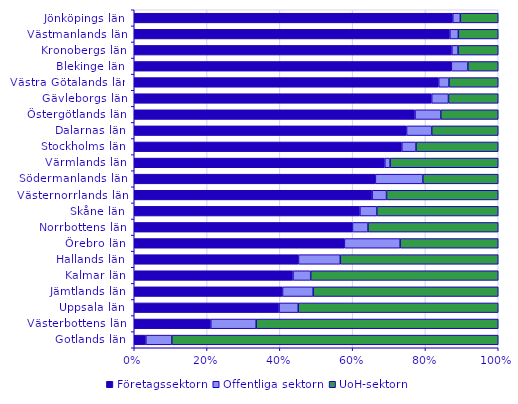
| Category | Företagssektorn | Offentliga sektorn | UoH-sektorn |
|---|---|---|---|
| Jönköpings län | 2723 | 65 | 324 |
| Västmanlands län | 2537 | 68 | 321 |
| Kronobergs län | 2087 | 41 | 264 |
| Blekinge län | 1784 | 93 | 171 |
| Västra Götalands län | 45122 | 1522 | 7303 |
| Gävleborgs län | 1099 | 62 | 184 |
| Östergötlands län | 10593 | 973 | 2169 |
| Dalarnas län | 704 | 65 | 172 |
| Stockholms län | 45843 | 2443 | 14089 |
| Värmlands län | 1047 | 22 | 452 |
| Södermanlands län | 259 | 51 | 81 |
| Västernorrlands län | 594 | 36 | 279 |
| Skåne län | 12714 | 952 | 6843 |
| Norrbottens län | 1670 | 119 | 997 |
| Örebro län | 1225 | 325 | 572 |
| Hallands län | 314 | 80 | 302 |
| Kalmar län | 286 | 32 | 338 |
| Jämtlands län | 121 | 25 | 151 |
| Uppsala län | 3594 | 476 | 4965 |
| Västerbottens län | 908 | 539 | 2873 |
| Gotlands län | 4 | 9 | 113 |